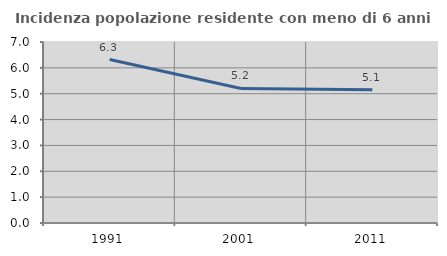
| Category | Incidenza popolazione residente con meno di 6 anni |
|---|---|
| 1991.0 | 6.322 |
| 2001.0 | 5.205 |
| 2011.0 | 5.15 |